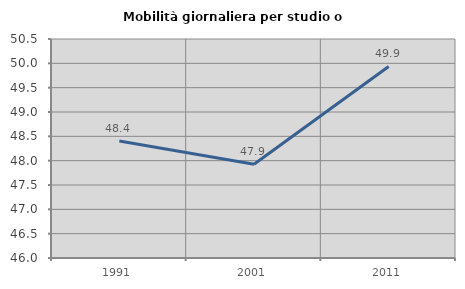
| Category | Mobilità giornaliera per studio o lavoro |
|---|---|
| 1991.0 | 48.404 |
| 2001.0 | 47.927 |
| 2011.0 | 49.936 |